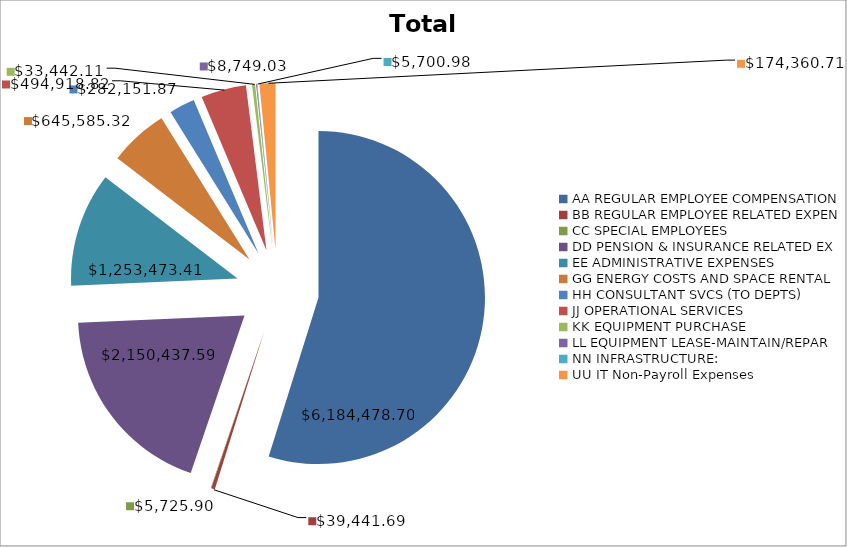
| Category | Total |
|---|---|
| 0 | 6184478.7 |
| 1 | 39441.69 |
| 2 | 5725.9 |
| 3 | 2150437.59 |
| 4 | 1253473.41 |
| 5 | 645585.32 |
| 6 | 282151.87 |
| 7 | 494918.82 |
| 8 | 33442.11 |
| 9 | 8749.03 |
| 10 | 5700.98 |
| 11 | 174360.71 |